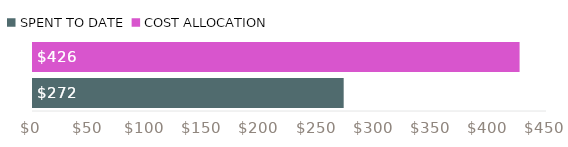
| Category | Series 0 |
|---|---|
| SPENT TO DATE | 272 |
| COST ALLOCATION | 426 |